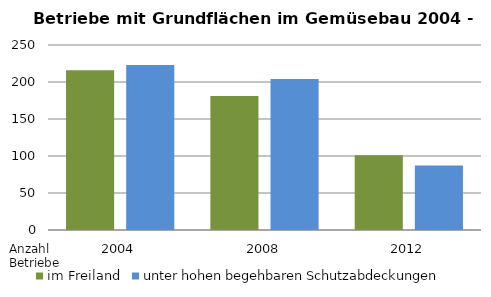
| Category | im Freiland | unter hohen begehbaren Schutzabdeckungen |
|---|---|---|
| 2004.0 | 216 | 223 |
| 2008.0 | 181 | 204 |
| 2012.0 | 101 | 87 |